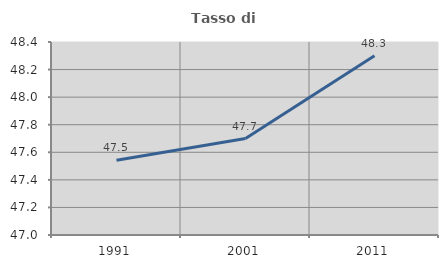
| Category | Tasso di occupazione   |
|---|---|
| 1991.0 | 47.541 |
| 2001.0 | 47.7 |
| 2011.0 | 48.301 |